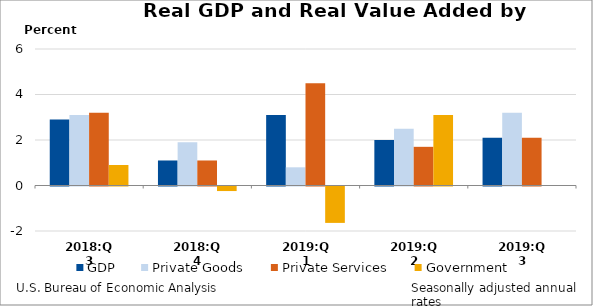
| Category | GDP | Private Goods | Private Services | Government |
|---|---|---|---|---|
| 2018:Q3 | 2.9 | 3.1 | 3.2 | 0.9 |
| 2018:Q4 | 1.1 | 1.9 | 1.1 | -0.2 |
| 2019:Q1 | 3.1 | 0.8 | 4.5 | -1.6 |
| 2019:Q2 | 2 | 2.5 | 1.7 | 3.1 |
| 2019:Q3 | 2.1 | 3.2 | 2.1 | 0 |